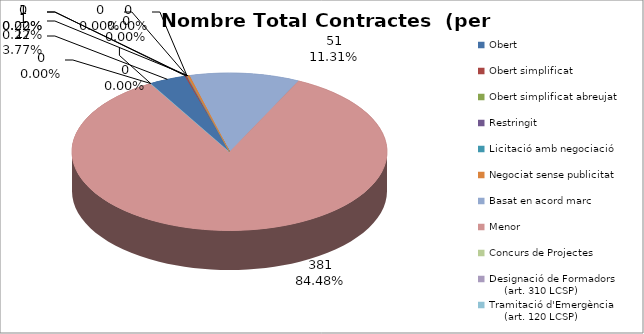
| Category | Nombre Total Contractes |
|---|---|
| Obert | 17 |
| Obert simplificat | 1 |
| Obert simplificat abreujat | 0 |
| Restringit | 0 |
| Licitació amb negociació | 0 |
| Negociat sense publicitat | 1 |
| Basat en acord marc | 51 |
| Menor | 381 |
| Concurs de Projectes | 0 |
| Designació de Formadors
     (art. 310 LCSP) | 0 |
| Tramitació d'Emergència
     (art. 120 LCSP) | 0 |